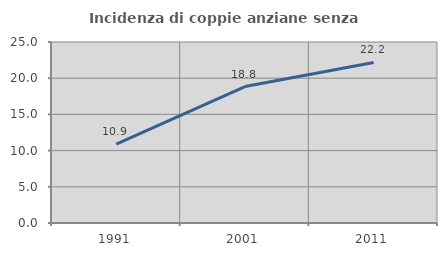
| Category | Incidenza di coppie anziane senza figli  |
|---|---|
| 1991.0 | 10.882 |
| 2001.0 | 18.841 |
| 2011.0 | 22.17 |